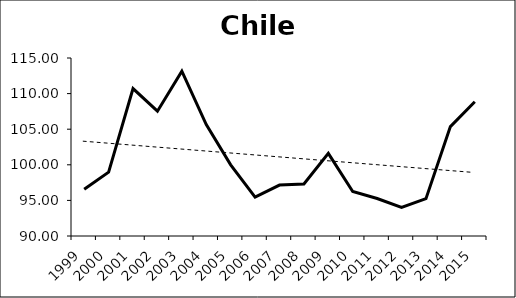
| Category | Series 0 |
|---|---|
| 1999.0 | 96.56 |
| 2000.0 | 98.97 |
| 2001.0 | 110.71 |
| 2002.0 | 107.53 |
| 2003.0 | 113.14 |
| 2004.0 | 105.64 |
| 2005.0 | 100 |
| 2006.0 | 95.46 |
| 2007.0 | 97.15 |
| 2008.0 | 97.3 |
| 2009.0 | 101.61 |
| 2010.0 | 96.25 |
| 2011.0 | 95.26 |
| 2012.0 | 94.01 |
| 2013.0 | 95.24 |
| 2014.0 | 105.36 |
| 2015.0 | 108.85 |